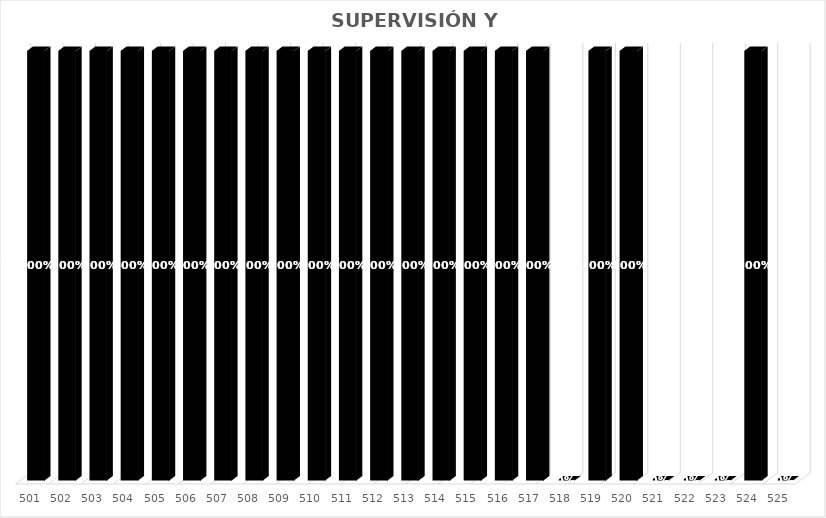
| Category | % Avance |
|---|---|
| 501.0 | 1 |
| 502.0 | 1 |
| 503.0 | 1 |
| 504.0 | 1 |
| 505.0 | 1 |
| 506.0 | 1 |
| 507.0 | 1 |
| 508.0 | 1 |
| 509.0 | 1 |
| 510.0 | 1 |
| 511.0 | 1 |
| 512.0 | 1 |
| 513.0 | 1 |
| 514.0 | 1 |
| 515.0 | 1 |
| 516.0 | 1 |
| 517.0 | 1 |
| 518.0 | 0 |
| 519.0 | 1 |
| 520.0 | 1 |
| 521.0 | 0 |
| 522.0 | 0 |
| 523.0 | 0 |
| 524.0 | 1 |
| 525.0 | 0 |